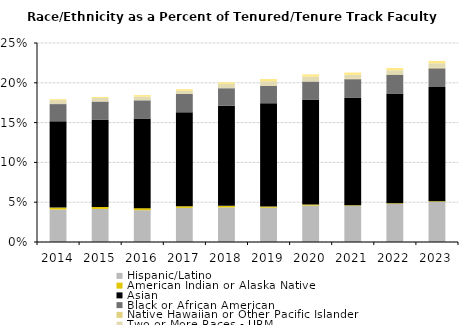
| Category | Hispanic/Latino | American Indian or Alaska Native | Asian  | Black or African American | Native Hawaiian or Other Pacific Islander | Two or More Races - URM | Two or More Races - Non-URM |
|---|---|---|---|---|---|---|---|
| 2014.0 | 0.041 | 0.002 | 0.108 | 0.022 | 0 | 0.005 | 0.001 |
| 2015.0 | 0.042 | 0.003 | 0.109 | 0.023 | 0 | 0.004 | 0.001 |
| 2016.0 | 0.04 | 0.003 | 0.113 | 0.023 | 0 | 0.005 | 0.002 |
| 2017.0 | 0.043 | 0.002 | 0.118 | 0.023 | 0 | 0.004 | 0.002 |
| 2018.0 | 0.043 | 0.002 | 0.126 | 0.022 | 0 | 0.005 | 0.002 |
| 2019.0 | 0.043 | 0.001 | 0.13 | 0.022 | 0 | 0.006 | 0.003 |
| 2020.0 | 0.046 | 0.001 | 0.132 | 0.023 | 0 | 0.006 | 0.003 |
| 2021.0 | 0.046 | 0.001 | 0.135 | 0.023 | 0.001 | 0.005 | 0.003 |
| 2022.0 | 0.048 | 0.001 | 0.138 | 0.024 | 0.001 | 0.005 | 0.003 |
| 2023.0 | 0.05 | 0.001 | 0.144 | 0.023 | 0.001 | 0.006 | 0.003 |